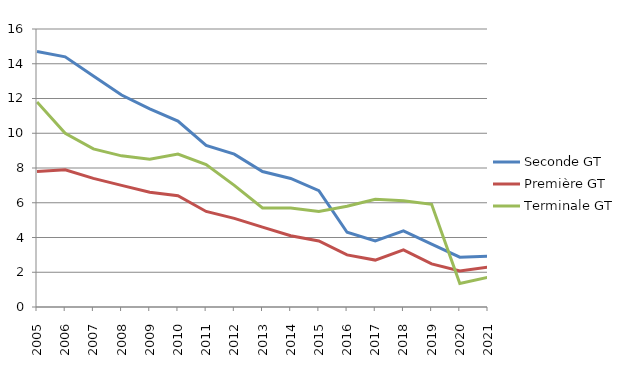
| Category | Seconde GT | Première GT | Terminale GT |
|---|---|---|---|
| 2005.0 | 14.7 | 7.8 | 11.8 |
| 2006.0 | 14.4 | 7.9 | 10 |
| 2007.0 | 13.3 | 7.4 | 9.1 |
| 2008.0 | 12.2 | 7 | 8.7 |
| 2009.0 | 11.4 | 6.6 | 8.5 |
| 2010.0 | 10.7 | 6.4 | 8.8 |
| 2011.0 | 9.3 | 5.5 | 8.2 |
| 2012.0 | 8.8 | 5.1 | 7 |
| 2013.0 | 7.8 | 4.6 | 5.7 |
| 2014.0 | 7.4 | 4.1 | 5.7 |
| 2015.0 | 6.7 | 3.8 | 5.5 |
| 2016.0 | 4.3 | 3 | 5.8 |
| 2017.0 | 3.8 | 2.7 | 6.2 |
| 2018.0 | 4.38 | 3.29 | 6.12 |
| 2019.0 | 3.62 | 2.48 | 5.91 |
| 2020.0 | 2.87 | 2.07 | 1.35 |
| 2021.0 | 2.92 | 2.3 | 1.71 |